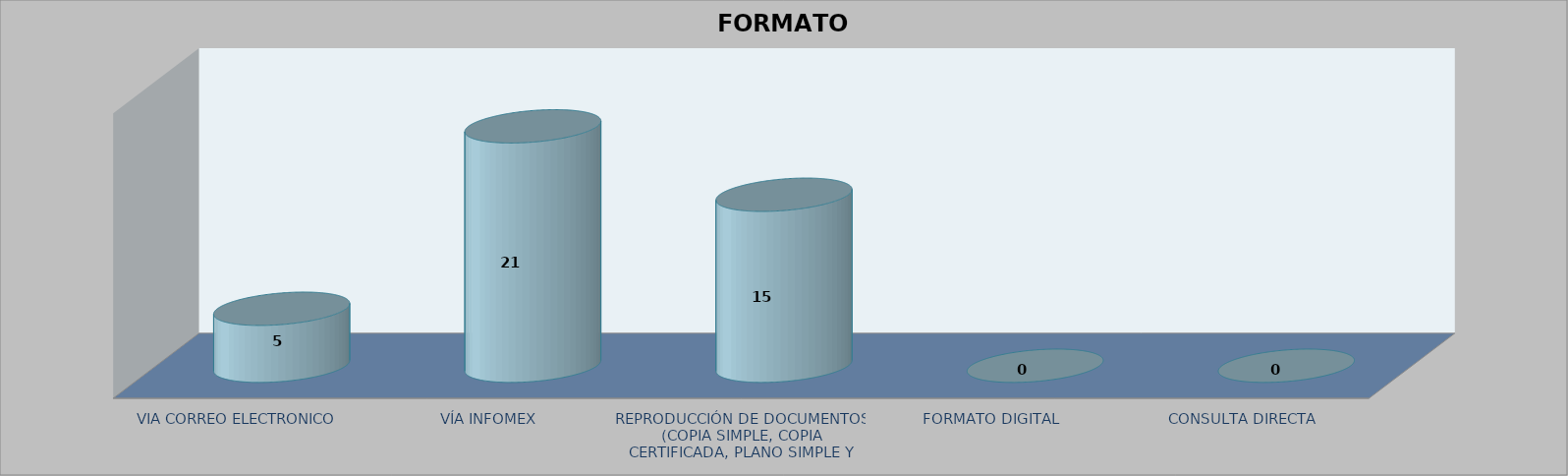
| Category |        FORMATO SOLICITADO | Series 1 | Series 2 |
|---|---|---|---|
| VIA CORREO ELECTRONICO |  |  | 5 |
| VÍA INFOMEX |  |  | 21 |
| REPRODUCCIÓN DE DOCUMENTOS (COPIA SIMPLE, COPIA CERTIFICADA, PLANO SIMPLE Y PLANO CERTIFICADO) |  |  | 15 |
| FORMATO DIGITAL |  |  | 0 |
| CONSULTA DIRECTA |  |  | 0 |